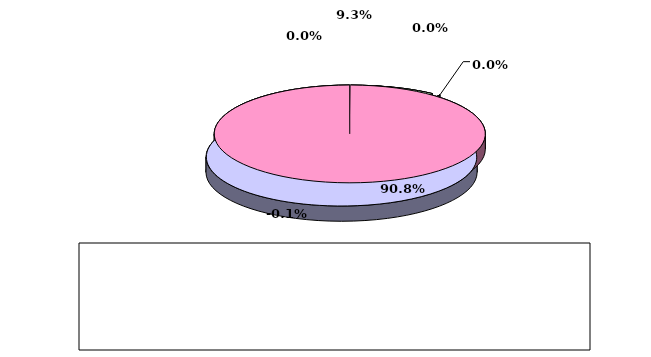
| Category | Series 0 |
|---|---|
| מזומנים ושווי מזומנים | 0.093 |
| אג"ח ממשלתיות סחירות | 0 |
| אג"ח קונצרני סחיר | 0 |
| ני"ע אחרים סחירים | 0.908 |
| פקדונות והלוואות | 0 |
| השקעות אחרות | -0.001 |